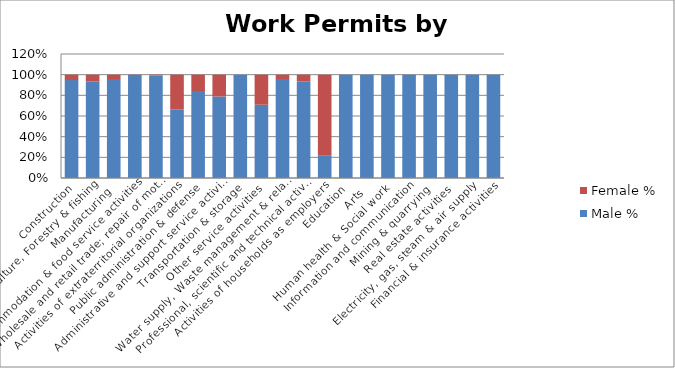
| Category | Male % | Female % |
|---|---|---|
| Construction | 0.947 | 0.053 |
| Agriculture, Forestry & fishing | 0.934 | 0.066 |
| Manufacturing | 0.949 | 0.051 |
| Accommodation & food service activities | 0.998 | 0.002 |
| Wholesale and retail trade; repair of motor vehicles  | 0.993 | 0.007 |
| Activities of extraterritorial organizations  | 0.661 | 0.339 |
| Public administration & defense | 0.841 | 0.159 |
| Administrative and support service activities | 0.789 | 0.211 |
|  Transportation & storage | 1 | 0 |
| Other service activities | 0.709 | 0.291 |
| Water supply, Waste management & related activities | 0.958 | 0.042 |
| Professional, scientific and technical activities | 0.938 | 0.062 |
| Activities of households as employers | 0.215 | 0.785 |
| Education | 1 | 0 |
| Arts | 1 | 0 |
| Human health & Social work | 1 | 0 |
|  Information and communication | 1 | 0 |
| Mining & quarrying | 1 | 0 |
| Real estate activities | 1 | 0 |
| Electricity, gas, steam & air supply | 1 | 0 |
| Financial & insurance activities | 1 | 0 |